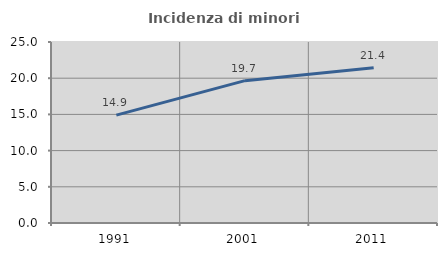
| Category | Incidenza di minori stranieri |
|---|---|
| 1991.0 | 14.894 |
| 2001.0 | 19.658 |
| 2011.0 | 21.44 |